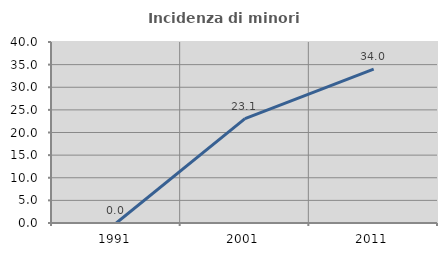
| Category | Incidenza di minori stranieri |
|---|---|
| 1991.0 | 0 |
| 2001.0 | 23.077 |
| 2011.0 | 34.021 |